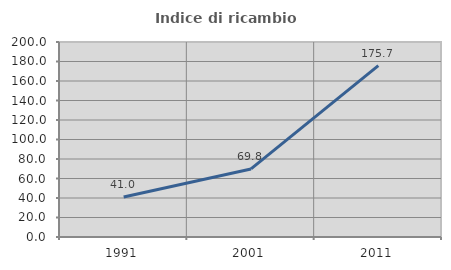
| Category | Indice di ricambio occupazionale  |
|---|---|
| 1991.0 | 40.955 |
| 2001.0 | 69.822 |
| 2011.0 | 175.738 |